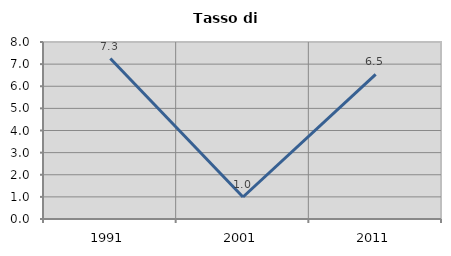
| Category | Tasso di disoccupazione   |
|---|---|
| 1991.0 | 7.254 |
| 2001.0 | 0.995 |
| 2011.0 | 6.533 |